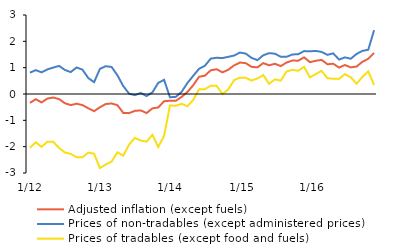
| Category | Adjusted inflation (except fuels) | Prices of non-tradables (except administered prices) | Prices of tradables (except food and fuels) |
|---|---|---|---|
|  1/12 | -0.338 | 0.811 | -2.043 |
| 2 | -0.197 | 0.906 | -1.833 |
| 3 | -0.32 | 0.822 | -2.008 |
| 4 | -0.171 | 0.936 | -1.812 |
| 5 | -0.134 | 1.004 | -1.816 |
| 6 | -0.193 | 1.066 | -2.051 |
| 7 | -0.351 | 0.913 | -2.221 |
| 8 | -0.421 | 0.833 | -2.275 |
| 9 | -0.37 | 1.007 | -2.403 |
| 10 | -0.42 | 0.926 | -2.404 |
| 11 | -0.54 | 0.608 | -2.228 |
| 12 | -0.652 | 0.449 | -2.265 |
|  1/13 | -0.505 | 0.955 | -2.814 |
| 2 | -0.381 | 1.055 | -2.675 |
| 3 | -0.36 | 1.027 | -2.566 |
| 4 | -0.424 | 0.71 | -2.213 |
| 5 | -0.72 | 0.302 | -2.342 |
| 6 | -0.727 | 0.012 | -1.92 |
| 7 | -0.64 | -0.044 | -1.666 |
| 8 | -0.622 | 0.04 | -1.769 |
| 9 | -0.724 | -0.077 | -1.809 |
| 10 | -0.545 | 0.063 | -1.549 |
| 11 | -0.511 | 0.423 | -2.011 |
| 12 | -0.275 | 0.537 | -1.592 |
|  1/14 | -0.256 | -0.123 | -0.438 |
| 2 | -0.26 | -0.109 | -0.447 |
| 3 | -0.111 | 0.08 | -0.372 |
| 4 | 0.076 | 0.416 | -0.463 |
| 5 | 0.335 | 0.692 | -0.226 |
| 6 | 0.655 | 0.958 | 0.181 |
| 7 | 0.696 | 1.073 | 0.184 |
| 8 | 0.902 | 1.344 | 0.313 |
| 9 | 0.94 | 1.376 | 0.31 |
| 10 | 0.822 | 1.363 | -0.001 |
| 11 | 0.92 | 1.412 | 0.172 |
| 12 | 1.086 | 1.46 | 0.527 |
|   1/15 | 1.195 | 1.573 | 0.619 |
| 2 | 1.172 | 1.535 | 0.614 |
| 3 | 1.031 | 1.371 | 0.509 |
| 4 | 1.011 | 1.287 | 0.591 |
| 5 | 1.173 | 1.471 | 0.719 |
| 6 | 1.089 | 1.551 | 0.388 |
| 7 | 1.148 | 1.53 | 0.555 |
| 8 | 1.061 | 1.414 | 0.509 |
| 9 | 1.196 | 1.414 | 0.856 |
| 10 | 1.271 | 1.501 | 0.916 |
| 11 | 1.265 | 1.512 | 0.885 |
| 12 | 1.393 | 1.629 | 1.032 |
|   1/16 | 1.209 | 1.623 | 0.631 |
| 2 | 1.262 | 1.634 | 0.759 |
| 3 | 1.295 | 1.599 | 0.878 |
| 4 | 1.129 | 1.487 | 0.601 |
| 5 | 1.149 | 1.543 | 0.577 |
| 6 | 1.003 | 1.307 | 0.574 |
| 7 | 1.101 | 1.391 | 0.756 |
| 8 | 1.01 | 1.338 | 0.634 |
| 9 | 1.042 | 1.522 | 0.391 |
| 10 | 1.223 | 1.636 | 0.647 |
| 11 | 1.337 | 1.68 | 0.859 |
| 12 | 1.563 | 2.424 | 0.346 |